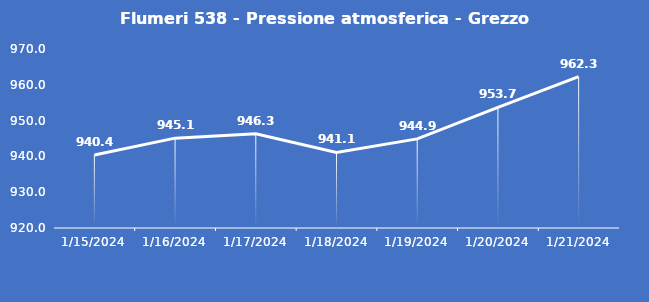
| Category | Flumeri 538 - Pressione atmosferica - Grezzo (hPa) |
|---|---|
| 1/15/24 | 940.4 |
| 1/16/24 | 945.1 |
| 1/17/24 | 946.3 |
| 1/18/24 | 941.1 |
| 1/19/24 | 944.9 |
| 1/20/24 | 953.7 |
| 1/21/24 | 962.3 |